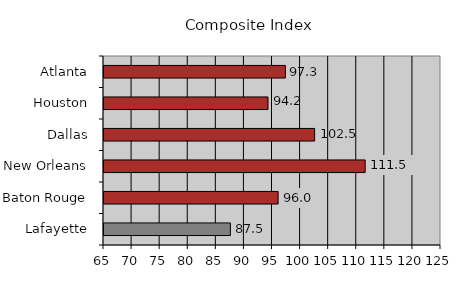
| Category | 87.5 |
|---|---|
| Lafayette | 87.5 |
| Baton Rouge | 96 |
| New Orleans | 111.5 |
| Dallas | 102.5 |
| Houston | 94.2 |
| Atlanta | 97.3 |